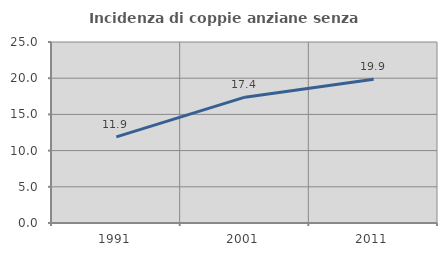
| Category | Incidenza di coppie anziane senza figli  |
|---|---|
| 1991.0 | 11.905 |
| 2001.0 | 17.377 |
| 2011.0 | 19.866 |